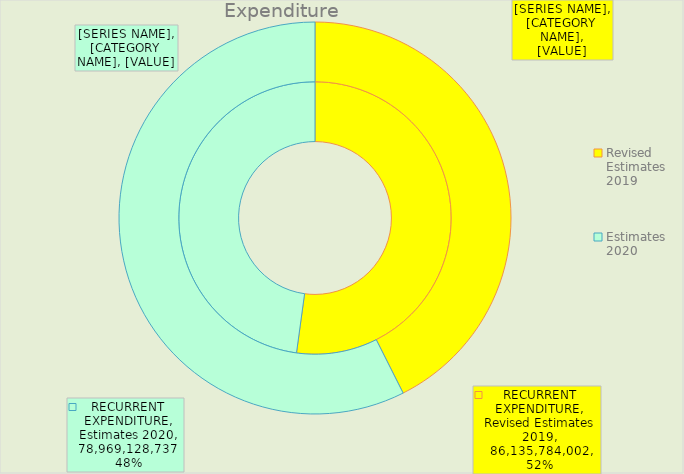
| Category | RECURRENT EXPENDITURE | CAPITAL EXPENDITURE |
|---|---|---|
| Revised Estimates 2019 | 86135784002 | 72036276969 |
| Estimates 2020 | 78969128737.498 | 97153963194 |